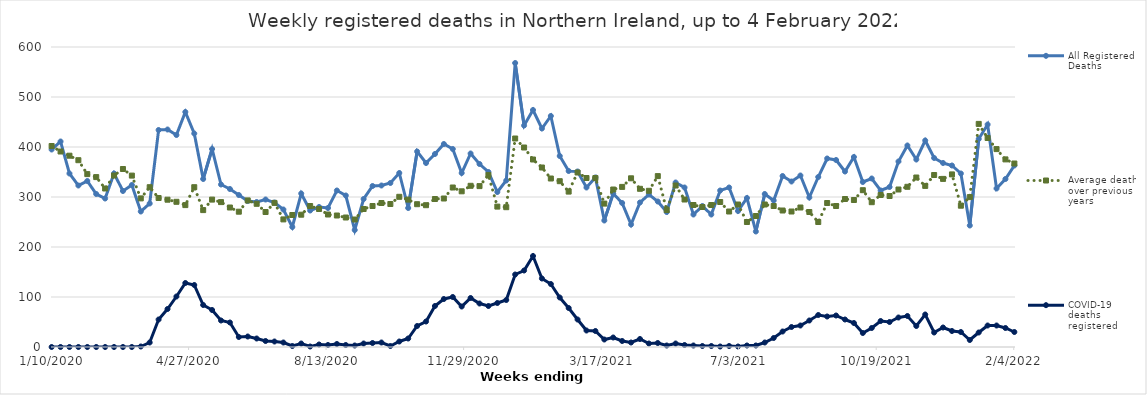
| Category | All Registered Deaths | Average deaths over previous 5 years | COVID-19 deaths registered |
|---|---|---|---|
| 1/10/20 | 395 | 402 | 0 |
| 1/17/20 | 411 | 391 | 0 |
| 1/24/20 | 347 | 382.6 | 0 |
| 1/31/20 | 323 | 373.6 | 0 |
| 2/7/20 | 332 | 345.8 | 0 |
| 2/14/20 | 306 | 339.8 | 0 |
| 2/21/20 | 297 | 317 | 0 |
| 2/28/20 | 347 | 343 | 0 |
| 3/6/20 | 312 | 356 | 0 |
| 3/13/20 | 324 | 342.8 | 0 |
| 3/20/20 | 271 | 297.2 | 1 |
| 3/27/20 | 287 | 319.6 | 9 |
| 4/3/20 | 434 | 298 | 55 |
| 4/10/20 | 435 | 294.6 | 76 |
| 4/17/20 | 424 | 290.4 | 101 |
| 4/24/20 | 470 | 283.8 | 128 |
| 5/1/20 | 427 | 319.6 | 124 |
| 5/8/20 | 336 | 273.8 | 84 |
| 5/15/20 | 396 | 294.8 | 74 |
| 5/22/20 | 325 | 289.8 | 53 |
| 5/29/20 | 316 | 279 | 49 |
| 6/5/20 | 304 | 270.6 | 20 |
| 6/12/20 | 292 | 293.2 | 21 |
| 6/19/20 | 290 | 286.4 | 17 |
| 6/26/20 | 295 | 270 | 12 |
| 7/3/20 | 289 | 288.2 | 11 |
| 7/10/20 | 275 | 255.2 | 9 |
| 7/17/20 | 240 | 264 | 2 |
| 7/24/20 | 307 | 264.6 | 7 |
| 7/31/20 | 273 | 282 | 1 |
| 8/7/20 | 280 | 276 | 5 |
| 8/14/20 | 278 | 265 | 4 |
| 8/21/20 | 313 | 263 | 6 |
| 8/28/20 | 303 | 259 | 4 |
| 9/4/20 | 234 | 255 | 3 |
| 9/11/20 | 296 | 276 | 7 |
| 9/18/20 | 322 | 282 | 8 |
| 9/25/20 | 323 | 288 | 9 |
| 10/2/20 | 328 | 286 | 2 |
| 10/9/20 | 348 | 300.4 | 11 |
| 10/16/20 | 278 | 294.8 | 17 |
| 10/23/20 | 391 | 285.6 | 42 |
| 10/30/20 | 368 | 283.6 | 51 |
| 11/6/20 | 386 | 296 | 82 |
| 11/13/20 | 406 | 297 | 96 |
| 11/20/20 | 396 | 319 | 100 |
| 11/27/20 | 348 | 311.4 | 81 |
| 12/4/20 | 387 | 322.4 | 98 |
| 12/11/20 | 366 | 321.8 | 87 |
| 12/18/20 | 350 | 343.8 | 82 |
| 12/25/20 | 310 | 280.8 | 88 |
| 1/1/21 | 333 | 279.6 | 94 |
| 1/8/21 | 568 | 417 | 145 |
| 1/15/21 | 443 | 399 | 153 |
| 1/22/21 | 474 | 375 | 182 |
| 1/29/21 | 437 | 359 | 137 |
| 2/5/21 | 462 | 337 | 126 |
| 2/12/21 | 382 | 331.6 | 99 |
| 2/19/21 | 352 | 310.8 | 78 |
| 2/26/21 | 351 | 349 | 55 |
| 3/5/21 | 319 | 338 | 33 |
| 3/12/21 | 339 | 338 | 32 |
| 3/19/21 | 253 | 286.8 | 15 |
| 3/26/21 | 307 | 315 | 19 |
| 4/2/21 | 288 | 320.2 | 12 |
| 4/9/21 | 245 | 337.4 | 9 |
| 4/16/21 | 289 | 316.4 | 16 |
| 4/23/21 | 305 | 312.4 | 7 |
| 4/30/21 | 291 | 341.8 | 8 |
| 5/7/21 | 270 | 274 | 3 |
| 5/14/21 | 329 | 323 | 7 |
| 5/21/21 | 319 | 295 | 4 |
| 5/28/21 | 265 | 284 | 3 |
| 6/4/21 | 282 | 280 | 2 |
| 6/11/21 | 265 | 284 | 2 |
| 6/18/21 | 313 | 290 | 1 |
| 6/25/21 | 319 | 271 | 2 |
| 7/2/21 | 272 | 285 | 1 |
| 7/9/21 | 298 | 250 | 3 |
| 7/16/21 | 231 | 262 | 3 |
| 7/23/21 | 306 | 285 | 9 |
| 7/30/21 | 293 | 282 | 18 |
| 8/6/21 | 342 | 273 | 31 |
| 8/13/21 | 331 | 271 | 40 |
| 8/20/21 | 343 | 279 | 43 |
| 8/27/21 | 299 | 270 | 53 |
| 9/3/21 | 340 | 250 | 64 |
| 9/10/21 | 377 | 288 | 61 |
| 9/17/21 | 374 | 282 | 63 |
| 9/24/21 | 351 | 296 | 55 |
| 10/1/21 | 380 | 294 | 48 |
| 10/8/21 | 330 | 313.6 | 28 |
| 10/15/21 | 337 | 289.6 | 38 |
| 10/22/21 | 313 | 304 | 52 |
| 10/29/21 | 320 | 302 | 50 |
| 11/5/21 | 371 | 315 | 59 |
| 11/12/21 | 403 | 320.4 | 62 |
| 11/19/21 | 375 | 339 | 42 |
| 11/26/21 | 413 | 322.2 | 65 |
| 12/3/21 | 378 | 344 | 29 |
| 12/10/21 | 368 | 336.2 | 39 |
| 12/17/21 | 363 | 345.2 | 32 |
| 12/24/21 | 347 | 282.6 | 30 |
| 12/31/21 | 243 | 299.8 | 14 |
| 1/7/22 | 416 | 446.2 | 29 |
| 1/14/22 | 445 | 418 | 43 |
| 1/21/22 | 317 | 395.8 | 43 |
| 1/28/22 | 336 | 375.2 | 38 |
| 2/4/22 | 363 | 367 | 30 |